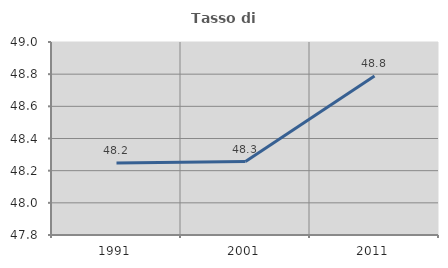
| Category | Tasso di occupazione   |
|---|---|
| 1991.0 | 48.247 |
| 2001.0 | 48.257 |
| 2011.0 | 48.789 |